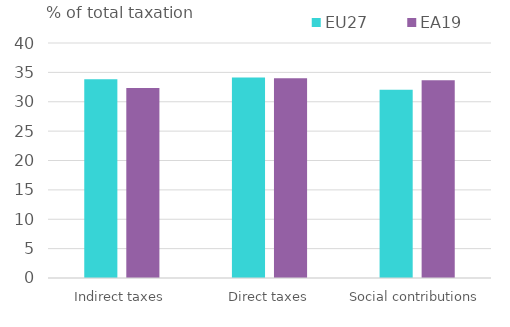
| Category | EU27 | EA19 |
|---|---|---|
| Indirect taxes | 33.811 | 32.329 |
| Direct taxes | 34.133 | 34.001 |
| Social contributions | 32.056 | 33.67 |